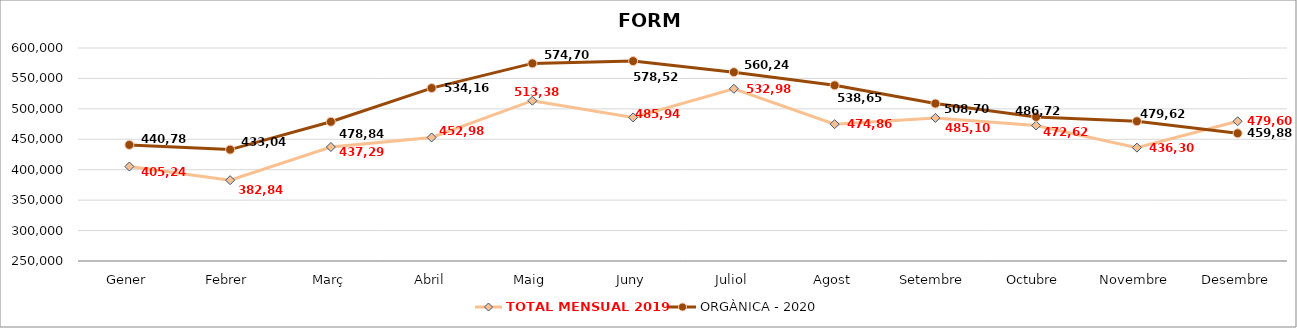
| Category | TOTAL MENSUAL 2019 | ORGÀNICA - 2020 |
|---|---|---|
| Gener | 405240 | 440780.04 |
| Febrer | 382840 | 433039.99 |
| Març | 437290.01 | 478840 |
| Abril | 452979.99 | 534160 |
| Maig | 513380 | 574700 |
| Juny | 485940.01 | 578520 |
| Juliol | 532980.03 | 560240.01 |
| Agost | 474860 | 538654 |
| Setembre | 485100 | 508699.99 |
| Octubre | 472620 | 486720 |
| Novembre | 436300 | 479620 |
| Desembre | 479600.01 | 459880 |